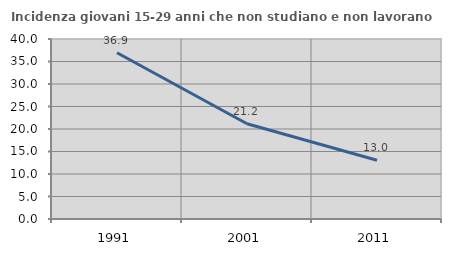
| Category | Incidenza giovani 15-29 anni che non studiano e non lavorano  |
|---|---|
| 1991.0 | 36.948 |
| 2001.0 | 21.154 |
| 2011.0 | 13.043 |